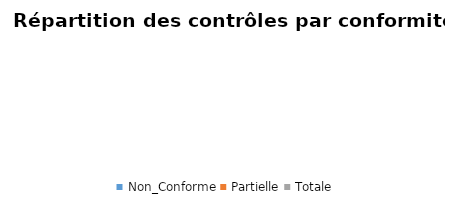
| Category | Series 0 |
|---|---|
| Non_Conforme | 0 |
| Partielle | 0 |
| Totale | 0 |